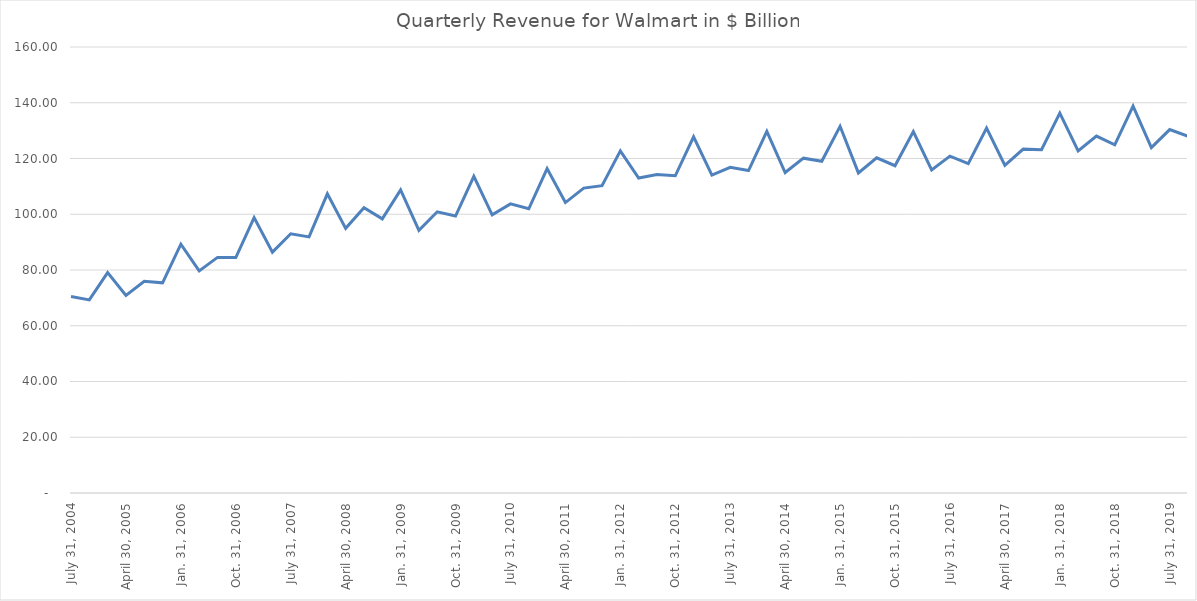
| Category | Series 0 |
|---|---|
| July 31, 2004 | 70.46 |
| Oct. 31, 2004 | 69.28 |
| Jan. 31, 2005 | 79.08 |
| April 30, 2005 | 70.91 |
| July 31, 2005 | 75.93 |
| Oct. 31, 2005 | 75.4 |
| Jan. 31, 2006 | 89.25 |
| April 30, 2006 | 79.68 |
| July 31, 2006 | 84.52 |
| Oct. 31, 2006 | 84.47 |
| Jan. 31, 2007 | 98.8 |
| April 30, 2007 | 86.41 |
| July 31, 2007 | 93 |
| Oct. 31, 2007 | 91.86 |
| Jan. 31, 2008 | 107.34 |
| April 30, 2008 | 94.94 |
| July 31, 2008 | 102.34 |
| Oct. 31, 2008 | 98.34 |
| Jan. 31, 2009 | 108.75 |
| April 30, 2009 | 94.24 |
| July 31, 2009 | 100.88 |
| Oct. 31, 2009 | 99.37 |
| Jan. 31, 2010 | 113.62 |
| April 30, 2010 | 99.81 |
| July 31, 2010 | 103.73 |
| Oct. 31, 2010 | 101.95 |
| Jan. 31, 2011 | 116.36 |
| April 30, 2011 | 104.19 |
| July 31, 2011 | 109.37 |
| Oct. 31, 2011 | 110.23 |
| Jan. 31, 2012 | 122.73 |
| April 30, 2012 | 113.01 |
| July 31, 2012 | 114.28 |
| Oct. 31, 2012 | 113.8 |
| Jan. 31, 2013 | 127.78 |
| April 30, 2013 | 114.07 |
| July 31, 2013 | 116.83 |
| Oct. 31, 2013 | 115.69 |
| Jan. 31, 2014 | 129.71 |
| April 30, 2014 | 114.96 |
| July 31, 2014 | 120.12 |
| Oct. 31, 2014 | 119 |
| Jan. 31, 2015 | 131.56 |
| April 30, 2015 | 114.83 |
| July 31, 2015 | 120.23 |
| Oct. 31, 2015 | 117.41 |
| Jan. 31, 2016 | 129.67 |
| April 30, 2016 | 115.9 |
| July 31, 2016 | 120.85 |
| Oct. 31, 2016 | 118.18 |
| Jan. 31, 2017 | 130.94 |
| April 30, 2017 | 117.54 |
| July 31, 2017 | 123.36 |
| Oct. 31, 2017 | 123.18 |
| Jan. 31, 2018 | 136.27 |
| April 30, 2018 | 122.69 |
| July 31, 2018 | 128.03 |
| Oct. 31, 2018 | 124.89 |
| Jan. 31, 2019 | 138.79 |
| April 30, 2019 | 123.92 |
| July 31, 2019 | 130.38 |
| Oct. 31, 2019 | 127.99 |